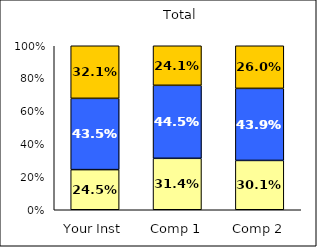
| Category | Low Habits of Mind | Average Habits of Mind | High Habits of Mind |
|---|---|---|---|
| Your Inst | 0.245 | 0.435 | 0.321 |
| Comp 1 | 0.314 | 0.445 | 0.241 |
| Comp 2 | 0.301 | 0.439 | 0.26 |